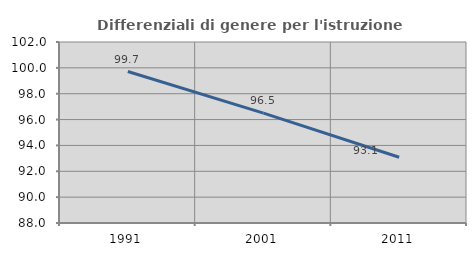
| Category | Differenziali di genere per l'istruzione superiore |
|---|---|
| 1991.0 | 99.715 |
| 2001.0 | 96.504 |
| 2011.0 | 93.084 |